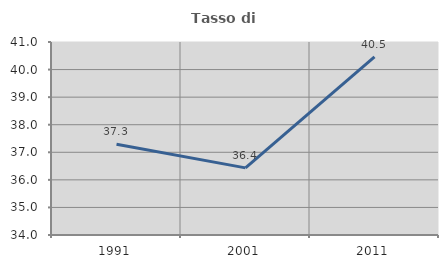
| Category | Tasso di occupazione   |
|---|---|
| 1991.0 | 37.288 |
| 2001.0 | 36.434 |
| 2011.0 | 40.464 |